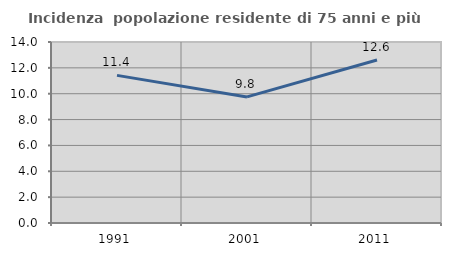
| Category | Incidenza  popolazione residente di 75 anni e più |
|---|---|
| 1991.0 | 11.417 |
| 2001.0 | 9.752 |
| 2011.0 | 12.605 |